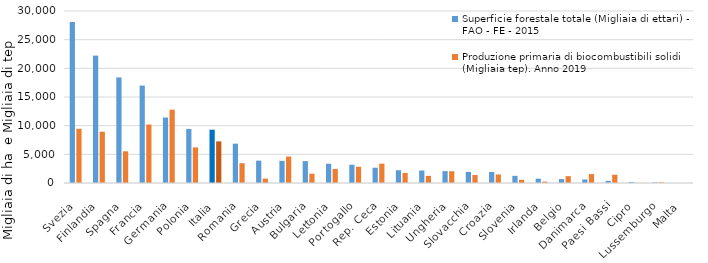
| Category | Superficie forestale totale (Migliaia di ettari) -
FAO - FE - 2015 | Produzione primaria di biocombustibili solidi 
(Migliaia tep). Anno 2019 |
|---|---|---|
| Svezia | 28073 | 9457.581 |
| Finlandia | 22218 | 8949.15 |
| Spagna | 18417.87 | 5527.778 |
| Francia | 16989 | 10194.325 |
| Germania | 11419 | 12786.281 |
| Polonia | 9435 | 6208.385 |
| Italia | 9297 | 7261.618 |
| Romania | 6861 | 3456.095 |
| Grecia | 3903 | 770.925 |
| Austria | 3869 | 4620.965 |
| Bulgaria | 3823 | 1620.446 |
| Lettonia | 3356 | 2454.985 |
| Portogallo | 3182.1 | 2829.548 |
| Rep. Ceca | 2667.41 | 3369.934 |
| Estonia | 2231.95 | 1763.113 |
| Lituania | 2180 | 1246.847 |
| Ungheria | 2069.13 | 2052.021 |
| Slovacchia | 1940 | 1398.729 |
| Croazia | 1922 | 1487.007 |
| Slovenia | 1248 | 546.546 |
| Irlanda | 754.02 | 236.886 |
| Belgio | 683.4 | 1198.116 |
| Danimarca | 612.23 | 1554.354 |
| Paesi Bassi | 376 | 1440.05 |
| Cipro | 172.7 | 24.95 |
| Lussemburgo | 86.75 | 113.703 |
| Malta | 0.35 | 0 |